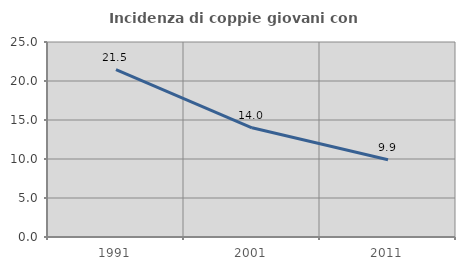
| Category | Incidenza di coppie giovani con figli |
|---|---|
| 1991.0 | 21.46 |
| 2001.0 | 14.004 |
| 2011.0 | 9.912 |